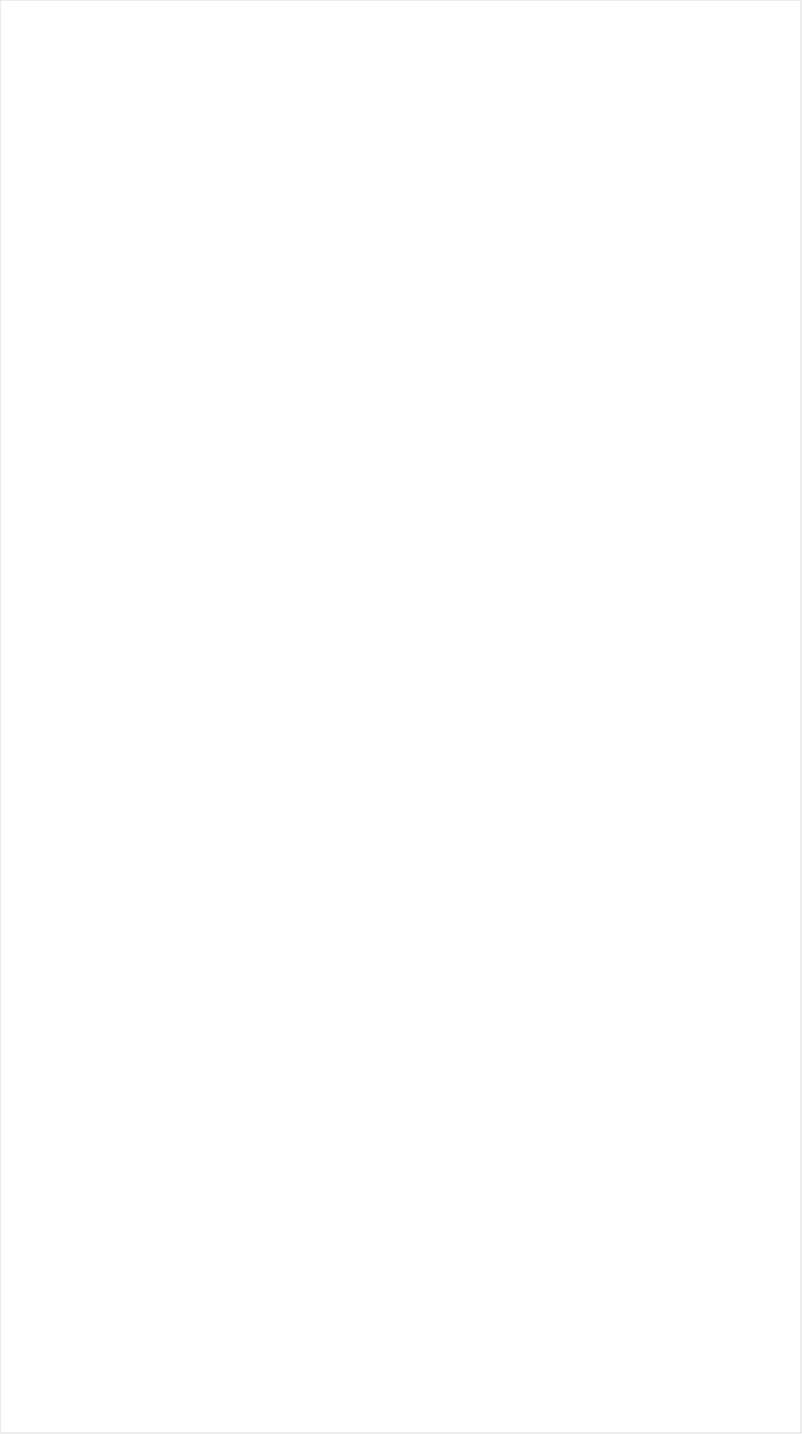
| Category | Total |
|---|---|
| Galavision | -0.924 |
| TUDN | -0.87 |
| Univision | -0.857 |
| UniMas | -0.855 |
| Telemundo | -0.851 |
| NBC Universo | -0.829 |
| VH1 | -0.666 |
| BET | -0.664 |
| TV ONE | -0.659 |
| MTV2 | -0.623 |
| Cartoon Network | -0.62 |
| Nick Toons | -0.594 |
| BET Her | -0.57 |
| Disney XD | -0.542 |
| Adult Swim | -0.538 |
| Lifetime Movies | -0.502 |
| Teen Nick | -0.492 |
| Nick | -0.486 |
| Logo | -0.475 |
| Nick Jr. | -0.472 |
| Travel | -0.396 |
| WE TV | -0.389 |
| Oprah Winfrey Network | -0.388 |
| Universal Kids | -0.384 |
| Disney Junior US | -0.382 |
| Discovery Life Channel | -0.378 |
| FXDEP | -0.371 |
| TLC | -0.352 |
| OXYGEN | -0.338 |
| Lifetime | -0.328 |
| Nick@Nite | -0.321 |
| Investigation Discovery | -0.319 |
| Disney Channel | -0.295 |
| MTV | -0.294 |
| Discovery Family Channel | -0.264 |
| UP TV | -0.259 |
| USA Network | -0.25 |
| SYFY | -0.221 |
| Freeform | -0.208 |
| Headline News | -0.17 |
| FXX | -0.165 |
| CMTV | -0.164 |
| E! | -0.163 |
| A&E | -0.144 |
| Hallmark | -0.137 |
| ION | -0.11 |
| INSP | -0.11 |
| Hallmark Movies & Mysteries | -0.104 |
| POP | -0.103 |
| TNT | -0.08 |
| NBA TV | -0.077 |
| FX | -0.074 |
| BRAVO | -0.067 |
| truTV | -0.065 |
| FX Movie Channel | -0.057 |
| TBS | -0.057 |
| Viceland | -0.056 |
| Paramount Network | -0.048 |
| Ovation | -0.043 |
| CW | -0.027 |
| Great American Country | -0.024 |
| FOX | -0.02 |
| Science Channel | 0.003 |
| Game Show | 0.017 |
| TV LAND | 0.017 |
| Animal Planet | 0.057 |
| Motor Trend Network | 0.065 |
| National Geographic Wild | 0.074 |
| Reelz Channel | 0.086 |
| RFD TV | 0.093 |
| History Channel | 0.094 |
| Weather Channel | 0.107 |
| Discovery Channel | 0.111 |
| MSNBC | 0.12 |
| CNN | 0.124 |
| Food Network | 0.126 |
| HGTV | 0.145 |
| FYI | 0.146 |
| American Heroes Channel | 0.166 |
| Comedy Central | 0.169 |
| Independent Film (IFC) | 0.177 |
| WGN America | 0.193 |
| AMC | 0.195 |
| BBC America | 0.199 |
| Cooking Channel | 0.221 |
| MyNetworkTV | 0.227 |
| Destination America | 0.236 |
| SundanceTV | 0.246 |
| National Geographic | 0.255 |
| ABC | 0.329 |
| DIY | 0.345 |
| NBC | 0.347 |
| CBS | 0.372 |
| CNBC | 0.381 |
| Smithsonian | 0.404 |
| Outdoor Channel | 0.453 |
| Fox News | 0.472 |
| PBS | 0.516 |
| The Sportsman Channel | 0.565 |
| NFL Network | 0.613 |
| FOX Sports 2 | 0.658 |
| Fox Business | 0.683 |
| ESPN | 0.683 |
| ESPNEWS | 0.704 |
| ESPN2 | 0.707 |
| ESPN Deportes | 0.725 |
| ESPNU | 0.797 |
| Fox Sports 1 | 0.811 |
| Olympic Channel | 0.92 |
| Bloomberg HD | 0.963 |
| NBC Sports | 1.019 |
| CBS Sports | 1.08 |
| PAC-12 Network | 1.128 |
| Tennis Channel | 1.157 |
| Big Ten Network | 1.29 |
| NHL | 1.364 |
| MLB Network | 1.369 |
| Golf | 6.288 |